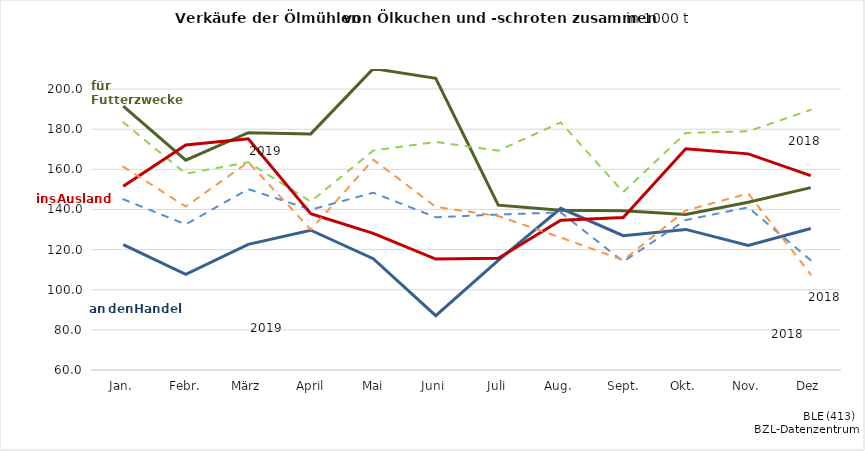
| Category | Futter19 | Futter18 | Handel19 | Handel18 | Ausland19 | Ausland18 |
|---|---|---|---|---|---|---|
| Jan. | 191.453 | 183.45 | 122.455 | 145.096 | 151.573 | 161.312 |
|  Febr. | 164.562 | 157.861 | 107.67 | 132.569 | 172.135 | 141.477 |
| März | 178.267 | 163.52 | 122.595 | 150.129 | 175.238 | 163.578 |
|  April | 177.657 | 143.921 | 129.651 | 139.88 | 137.886 | 129.994 |
|  Mai | 210.183 | 169.38 | 115.46 | 148.36 | 128.121 | 164.815 |
| Juni | 205.379 | 173.649 | 87.104 | 136.109 | 115.286 | 141.331 |
| Juli | 142.162 | 169.304 | 114.678 | 137.481 | 115.678 | 136.703 |
| Aug. | 139.668 | 183.384 | 140.567 | 138.534 | 134.671 | 126.001 |
|  Sept. | 139.421 | 148.692 | 126.916 | 113.998 | 135.975 | 114.768 |
| Okt. | 137.485 | 178.106 | 130.068 | 134.753 | 170.252 | 139.506 |
| Nov. | 143.636 | 178.991 | 122.055 | 141.045 | 167.706 | 147.968 |
| Dez | 150.9 | 189.644 | 130.537 | 114.654 | 156.9 | 107.552 |